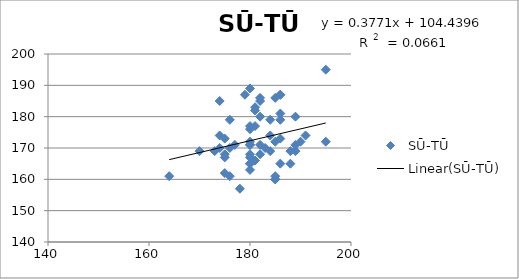
| Category | SŪ-TŪ |
|---|---|
| 177.0 | 171 |
| 175.0 | 168 |
| 175.0 | 162 |
| 185.0 | 161 |
| 164.0 | 161 |
| 191.0 | 174 |
| 185.0 | 160 |
| 182.0 | 185 |
| 181.0 | 182 |
| 174.0 | 174 |
| 173.0 | 169 |
| 174.0 | 170 |
| 176.0 | 170 |
| 190.0 | 172 |
| 181.0 | 166 |
| 180.0 | 168 |
| 180.0 | 165 |
| 180.0 | 163 |
| 181.0 | 177 |
| 180.0 | 176 |
| 195.0 | 172 |
| 185.0 | 172 |
| 188.0 | 165 |
| 184.0 | 169 |
| 175.0 | 173 |
| 180.0 | 172 |
| 180.0 | 171 |
| 175.0 | 167 |
| 181.0 | 183 |
| 186.0 | 165 |
| 180.0 | 167 |
| 185.0 | 160 |
| 189.0 | 169 |
| 189.0 | 180 |
| 186.0 | 181 |
| 176.0 | 179 |
| 182.0 | 186 |
| 180.0 | 189 |
| 182.0 | 180 |
| 195.0 | 195 |
| 179.0 | 187 |
| 184.0 | 179 |
| 170.0 | 169 |
| 189.0 | 171 |
| 184.0 | 174 |
| 176.0 | 161 |
| 186.0 | 187 |
| 186.0 | 187 |
| 186.0 | 179 |
| 174.0 | 185 |
| 180.0 | 171 |
| 178.0 | 157 |
| 185.0 | 186 |
| 180.0 | 165 |
| 186.0 | 173 |
| 180.0 | 177 |
| 183.0 | 170 |
| 182.0 | 168 |
| 188.0 | 169 |
| 182.0 | 171 |